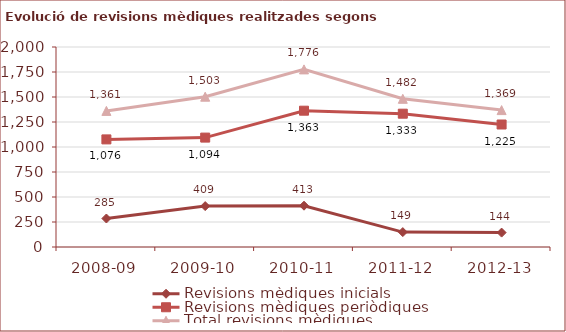
| Category | Revisions mèdiques inicials | Revisions mèdiques periòdiques | Total revisions mèdiques |
|---|---|---|---|
| 2008-09 | 285 | 1076 | 1361 |
| 2009-10 | 409 | 1094 | 1503 |
| 2010-11 | 413 | 1363 | 1776 |
| 2011-12 | 149 | 1333 | 1482 |
| 2012-13 | 144 | 1225 | 1369 |